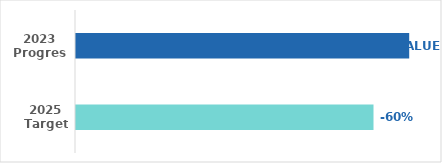
| Category | Series 0 |
|---|---|
| 2023 Progress | 0.66 |
| 2025 Target | 0.6 |